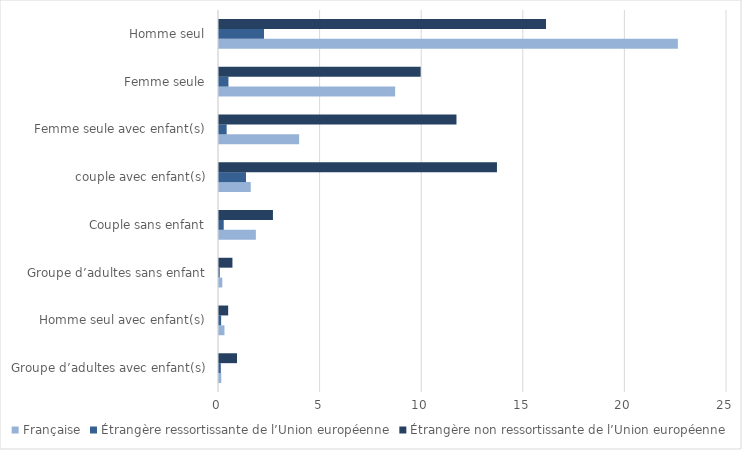
| Category | Française | Étrangère ressortissante de l’Union européenne | Étrangère non ressortissante de l’Union européenne |
|---|---|---|---|
| Groupe d’adultes avec enfant(s) | 0.112 | 0.089 | 0.885 |
| Homme seul avec enfant(s) | 0.269 | 0.105 | 0.451 |
| Groupe d’adultes sans enfant | 0.162 | 0.037 | 0.661 |
| Couple sans enfant | 1.814 | 0.232 | 2.655 |
| couple avec enfant(s) | 1.562 | 1.33 | 13.679 |
| Femme seule avec enfant(s) | 3.945 | 0.377 | 11.687 |
| Femme seule | 8.668 | 0.465 | 9.924 |
| Homme seul | 22.583 | 2.215 | 16.093 |